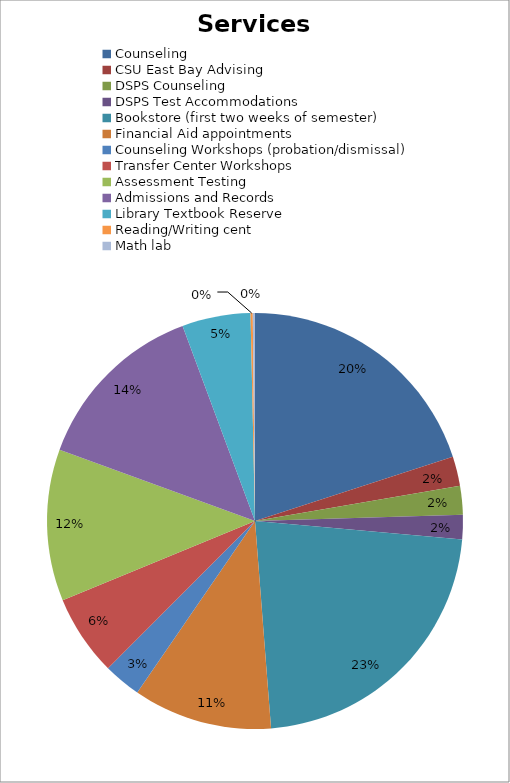
| Category | Series 0 |
|---|---|
| Counseling | 350 |
| CSU East Bay Advising | 40 |
| DSPS Counseling | 39 |
| DSPS Test Accommodations | 33 |
| Bookstore (first two weeks of semester) | 391 |
| Financial Aid appointments | 189 |
| Counseling Workshops (probation/dismissal) | 51 |
| Transfer Center Workshops | 110 |
| Assessment Testing | 206 |
| Admissions and Records | 241 |
| Library Textbook Reserve | 93 |
| Reading/Writing cent | 3 |
| Math lab | 3 |